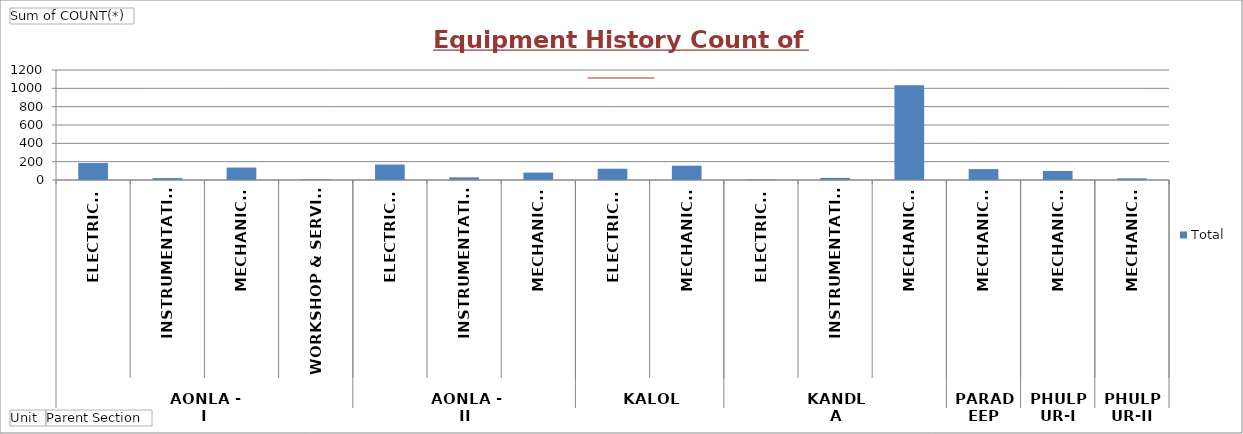
| Category | Total |
|---|---|
| 0 | 185 |
| 1 | 21 |
| 2 | 136 |
| 3 | 7 |
| 4 | 169 |
| 5 | 29 |
| 6 | 81 |
| 7 | 123 |
| 8 | 156 |
| 9 | 5 |
| 10 | 23 |
| 11 | 1035 |
| 12 | 119 |
| 13 | 98 |
| 14 | 18 |